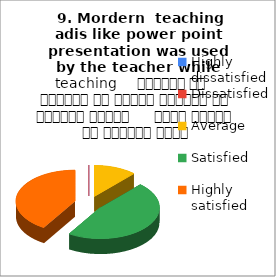
| Category |  9. Mordern  teaching adis like power point presentation was used by the teacher while teaching     शिक्षक ने शिक्षण के दौरान शिक्षण की आधुनिक तकनीक     पावर पॉइंट का प्रयोग किया |
|---|---|
| Highly dissatisfied | 0 |
| Dissatisfied | 0 |
| Average | 2 |
| Satisfied | 8 |
| Highly satisfied | 7 |